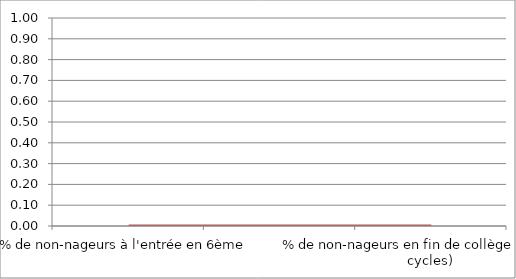
| Category | Series 1 |
|---|---|
| % de non-nageurs à l'entrée en 6ème | 0 |
| % de non-nageurs en fin de 6ème (après X cycles) | 0 |
| % de non-nageurs en fin de collège (après 2 cycles) | 0 |